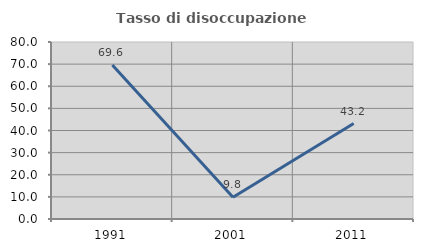
| Category | Tasso di disoccupazione giovanile  |
|---|---|
| 1991.0 | 69.608 |
| 2001.0 | 9.804 |
| 2011.0 | 43.158 |